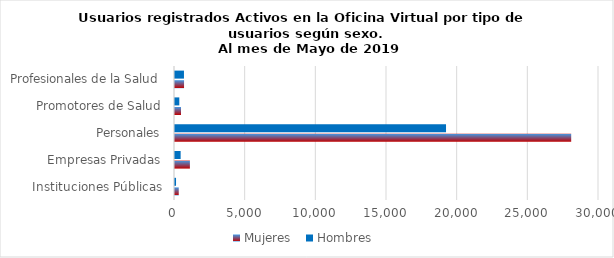
| Category | Mujeres | Hombres |
|---|---|---|
| Instituciones Públicas | 265 | 73 |
| Empresas Privadas | 1054 | 399 |
| Personales | 28033 | 19176 |
| Promotores de Salud | 425 | 304 |
| Profesionales de la Salud | 640 | 634 |